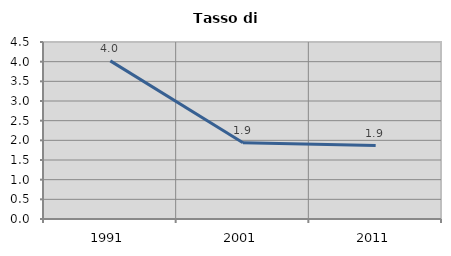
| Category | Tasso di disoccupazione   |
|---|---|
| 1991.0 | 4.021 |
| 2001.0 | 1.939 |
| 2011.0 | 1.867 |